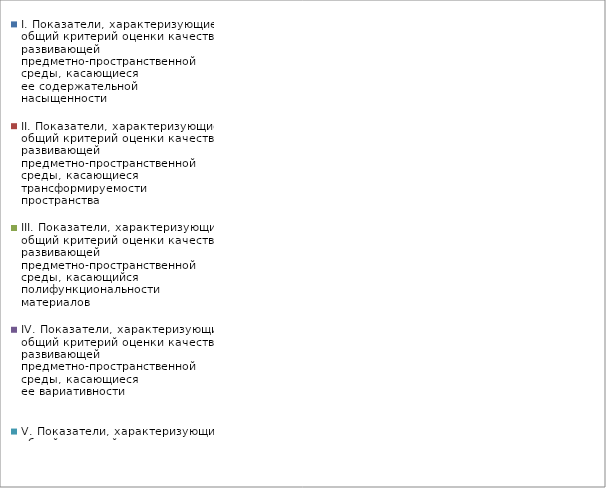
| Category | I. Показатели, характеризующие общий критерий оценки качества развивающей предметно-пространственной среды, касающиеся ее содержательной насыщенности | II. Показатели, характеризующие общий критерий оценки качества развивающей предметно-пространственной среды, касающиеся трансформируемости пространства | III. Показатели, характеризующие общий критерий оценки качества развивающей предметно-пространственной среды, касающийся полифункциональности материалов | IV. Показатели, характеризующие общий критерий оценки качества развивающей предметно-пространственной среды, касающиеся ее вариативности | V. Показатели, характеризующие общий критерий оценки качества развивающей предметно-пространственной среды, касающиеся ее доступности | VI. Показатели, характеризующие общий критерий оценки качества развивающей предметно-пространственной среды, касающиеся безопасности предметно-пространственной среды |
|---|---|---|---|---|---|---|
| Зайчата | 1 | 0.833 | 0.833 | 0.944 | 0.95 | 0.95 |